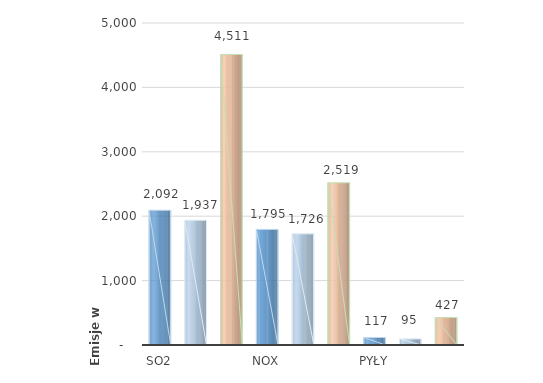
| Category | Series 0 |
|---|---|
| SO2 | 2092 |
|  | 1937 |
|  | 4510.77 |
| NOx | 1795 |
|  | 1726 |
|  | 2519.27 |
| Pyły | 117 |